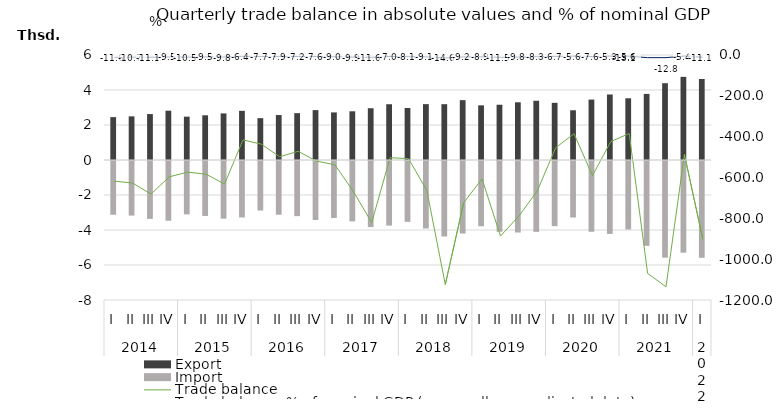
| Category | Export | Import |
|---|---|---|
| 0 | 2450.7 | -3068.8 |
| 1 | 2493.4 | -3120.5 |
| 2 | 2625.5 | -3306.5 |
| 3 | 2816.7 | -3413.2 |
| 4 | 2476.5 | -3050.1 |
| 5 | 2555.2 | -3139.2 |
| 6 | 2663.4 | -3295.5 |
| 7 | 2809.5 | -3225.4 |
| 8 | 2391.5 | -2828.1 |
| 9 | 2569.5 | -3068 |
| 10 | 2678.2 | -3149.9 |
| 11 | 2850.8 | -3370.5 |
| 12 | 2719.6 | -3257.4 |
| 13 | 2783.8 | -3452 |
| 14 | 2956.9 | -3777.4 |
| 15 | 3187 | -3690 |
| 16 | 2969.9 | -3477.4 |
| 17 | 3193.3 | -3857.4 |
| 18 | 3189.7 | -4313.9 |
| 19 | 3420.5 | -4144.2 |
| 20 | 3123.6 | -3730.2 |
| 21 | 3158.2 | -4044.8 |
| 22 | 3298.5 | -4087.5 |
| 23 | 3385.3 | -4051.1 |
| 24 | 3266.4 | -3720.9 |
| 25 | 2842.7 | -3228.3 |
| 26 | 3452.8 | -4043.7 |
| 27 | 3742.7 | -4166.6 |
| 28 | 3526.4 | -3910.9 |
| 29 | 3776.6 | -4846.3 |
| 30 | 4388.7 | -5523.8 |
| 31 | 4751.2 | -5238 |
| 32 | 4629.8 | -5531.8 |